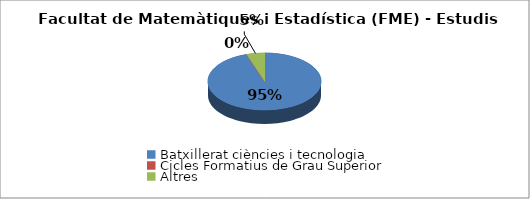
| Category | Facultat de Matemàtiques i Estadística (FME) - Estudis cursats |
|---|---|
| Batxillerat ciències i tecnologia | 0.949 |
| Cicles Formatius de Grau Superior | 0 |
| Altres | 0.051 |